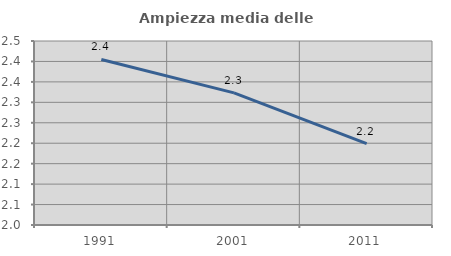
| Category | Ampiezza media delle famiglie |
|---|---|
| 1991.0 | 2.405 |
| 2001.0 | 2.323 |
| 2011.0 | 2.199 |